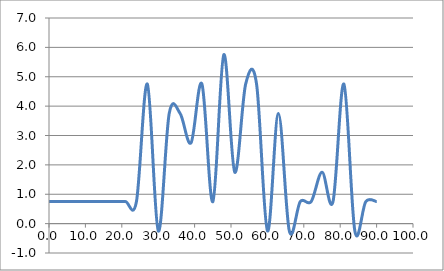
| Category | Elevation (in.) |
|---|---|
| 0.024 | 0.75 |
| 3.024 | 0.75 |
| 6.024 | 0.75 |
| 9.024000000000001 | 0.75 |
| 12.024000000000001 | 0.75 |
| 15.024000000000001 | 0.75 |
| 18.024 | 0.75 |
| 21.024 | 0.75 |
| 24.023999999999997 | 0.75 |
| 27.023999999999997 | 4.75 |
| 30.023999999999997 | -0.25 |
| 33.024 | 3.75 |
| 36.024 | 3.75 |
| 39.024 | 2.75 |
| 42.024 | 4.75 |
| 45.024 | 0.75 |
| 48.024 | 5.75 |
| 51.024 | 1.75 |
| 54.024 | 4.75 |
| 57.024 | 4.75 |
| 60.024 | -0.25 |
| 63.024 | 3.75 |
| 66.024 | -0.25 |
| 69.024 | 0.75 |
| 72.024 | 0.75 |
| 75.024 | 1.75 |
| 78.024 | 0.75 |
| 81.024 | 4.75 |
| 84.024 | -0.25 |
| 87.024 | 0.75 |
| 90.024 | 0.75 |